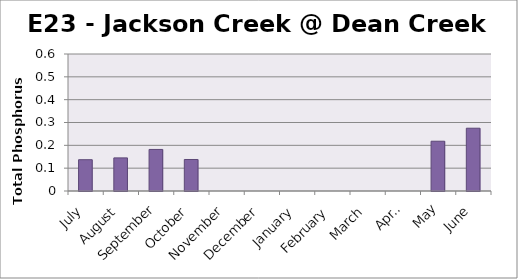
| Category | Phosphorus (mg/L) |
|---|---|
| July | 0.137 |
| August | 0.145 |
| September | 0.182 |
| October | 0.138 |
| November | 0 |
| December | 0 |
| January | 0 |
| February | 0 |
| March | 0 |
| April | 0 |
| May | 0.218 |
| June | 0.275 |